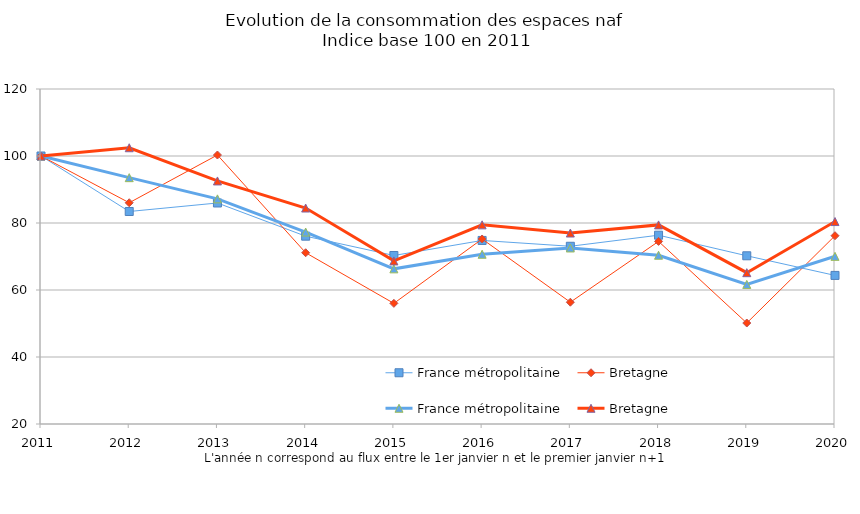
| Category | France métropolitaine  | Bretagne |
|---|---|---|
| 2011 | 100 | 100 |
| 2012 | 93.534 | 102.466 |
| 2013 | 87.203 | 92.555 |
| 2014 | 77.301 | 84.471 |
| 2015 | 66.314 | 68.684 |
| 2016 | 70.671 | 79.449 |
| 2017 | 72.546 | 77.01 |
| 2018 | 70.379 | 79.435 |
| 2019 | 61.669 | 65.17 |
| 2020 | 70.042 | 80.43 |